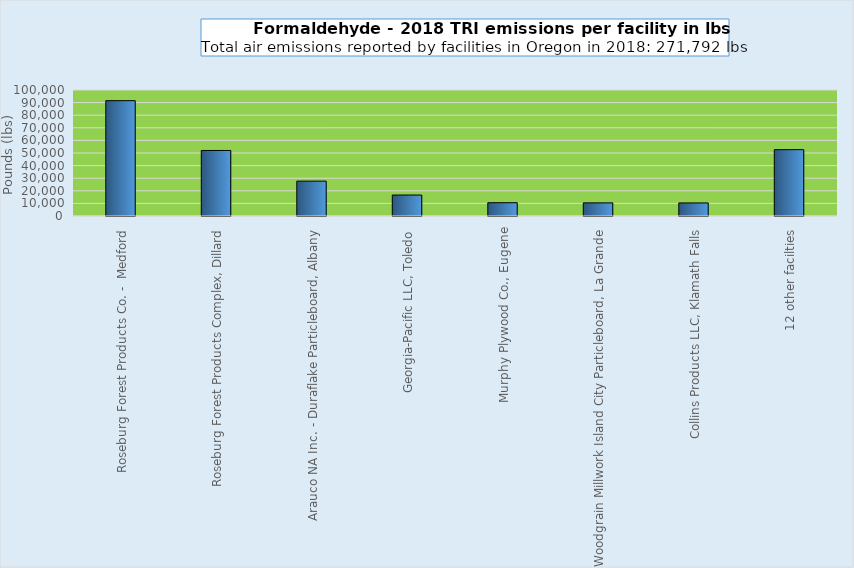
| Category | Series 0 |
|---|---|
| Roseburg Forest Products Co. -  Medford | 91538 |
| Roseburg Forest Products Complex, Dillard | 52002 |
| Arauco NA Inc. - Duraflake Particleboard, Albany | 27668 |
| Georgia-Pacific LLC, Toledo | 16634 |
| Murphy Plywood Co., Eugene | 10529 |
| Woodgrain Millwork Island City Particleboard, La Grande | 10413 |
| Collins Products LLC, Klamath Falls | 10359 |
| 12 other facilties | 52649 |